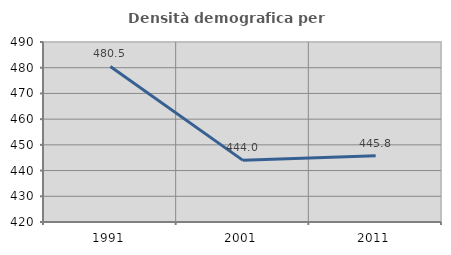
| Category | Densità demografica |
|---|---|
| 1991.0 | 480.51 |
| 2001.0 | 443.971 |
| 2011.0 | 445.777 |